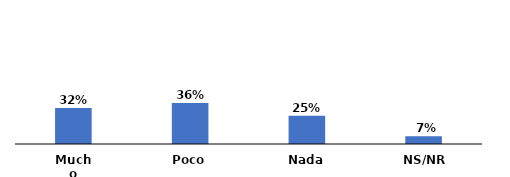
| Category | Series 0 |
|---|---|
| Mucho | 0.319 |
| Poco | 0.364 |
| Nada | 0.25 |
| NS/NR | 0.068 |